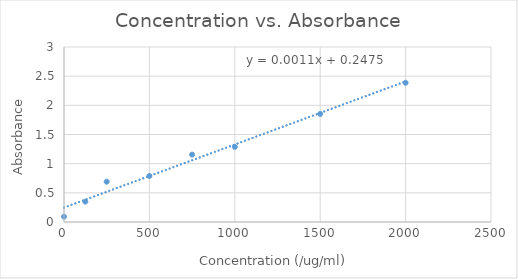
| Category | Absorbance |
|---|---|
| 0.0 | 0.091 |
| 125.0 | 0.349 |
| 250.0 | 0.691 |
| 500.0 | 0.789 |
| 750.0 | 1.156 |
| 1000.0 | 1.288 |
| 1500.0 | 1.853 |
| 2000.0 | 2.387 |